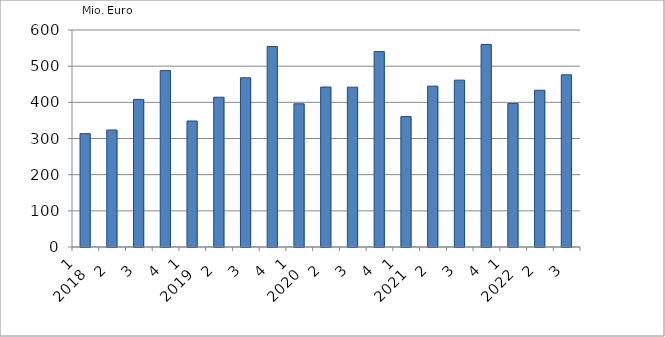
| Category | Ausbaugewerblicher Umsatz3 |
|---|---|
| 0 | 313433.569 |
| 1 | 323547.694 |
| 2 | 408057.42 |
| 3 | 487843.765 |
| 4 | 348466.115 |
| 5 | 414145.554 |
| 6 | 467849.207 |
| 7 | 554369.34 |
| 8 | 395996.128 |
| 9 | 442270.528 |
| 10 | 441987.109 |
| 11 | 540250.513 |
| 12 | 360578.959 |
| 13 | 444796.964 |
| 14 | 461290.095 |
| 15 | 559989.337 |
| 16 | 396959.135 |
| 17 | 433420.546 |
| 18 | 476099.112 |